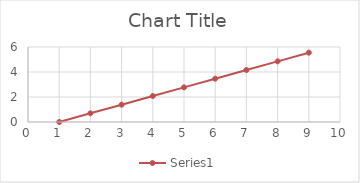
| Category | Series 1 |
|---|---|
| 1.0 | 0 |
| 2.0 | 0.693 |
| 3.0 | 1.386 |
| 4.0 | 2.079 |
| 5.0 | 2.773 |
| 6.0 | 3.466 |
| 7.0 | 4.159 |
| 8.0 | 4.852 |
| 9.0 | 5.545 |